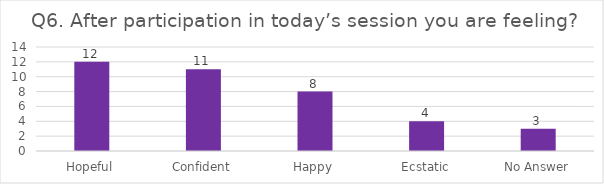
| Category | Q6. After participation in today’s session you are feeling? |
|---|---|
| Hopeful | 12 |
| Confident | 11 |
| Happy | 8 |
| Ecstatic | 4 |
| No Answer | 3 |